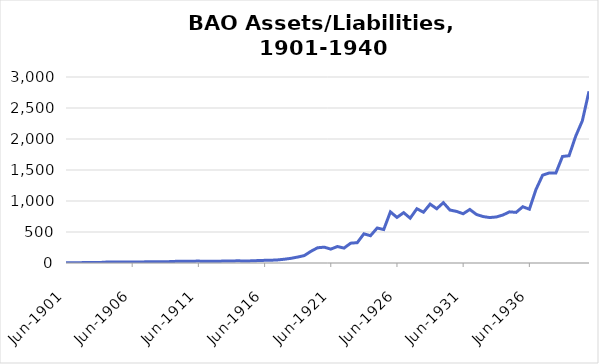
| Category | Series 0 |
|---|---|
| 1901-06-30 | 4347423.24 |
| 1901-12-31 | 5701801.87 |
| 1902-06-30 | 5460901.55 |
| 1902-12-31 | 6920376.16 |
| 1903-06-30 | 8138809.36 |
| 1903-12-31 | 7381254.11 |
| 1904-06-30 | 14180345.92 |
| 1904-12-31 | 14327951.69 |
| 1905-06-30 | 17002626.83 |
| 1905-12-31 | 15297768.24 |
| 1906-06-30 | 17615794.88 |
| 1906-12-31 | 16979536.36 |
| 1907-06-30 | 18381144.19 |
| 1907-12-31 | 19302410.73 |
| 1908-06-30 | 20133977.7 |
| 1908-12-31 | 18933944.17 |
| 1909-06-30 | 24284097 |
| 1909-12-31 | 28400846.69 |
| 1910-06-30 | 28297910.31 |
| 1910-12-31 | 28751207.71 |
| 1911-06-30 | 31184663.47 |
| 1911-12-31 | 26369824.47 |
| 1912-06-30 | 29372761.04 |
| 1912-12-31 | 28837219.37 |
| 1913-06-30 | 31783749.7 |
| 1913-12-31 | 31740690.29 |
| 1914-06-30 | 35888230.38 |
| 1914-12-31 | 30907130.49 |
| 1915-06-30 | 34930676.4 |
| 1915-12-31 | 39093168.69 |
| 1916-06-30 | 42729408.95 |
| 1916-12-31 | 44655643.8 |
| 1917-06-30 | 50157286.07 |
| 1917-12-31 | 61230954.44 |
| 1918-06-30 | 75609517.02 |
| 1918-12-31 | 96079346.49 |
| 1919-06-30 | 119604437.69 |
| 1919-12-31 | 188627129.17 |
| 1920-06-30 | 245568948.68 |
| 1920-12-31 | 255318210.12 |
| 1921-06-30 | 223939004.66 |
| 1921-12-31 | 265998252.59 |
| 1922-06-30 | 240257778.75 |
| 1922-12-31 | 319711208.13 |
| 1923-06-30 | 328044432.19 |
| 1923-12-31 | 470540181.49 |
| 1924-06-30 | 440120599.58 |
| 1924-12-31 | 564502137.2 |
| 1925-06-30 | 539677477.88 |
| 1925-12-31 | 824573455.46 |
| 1926-06-30 | 735535726.42 |
| 1926-12-31 | 812045960.24 |
| 1927-06-30 | 722893858.94 |
| 1927-12-31 | 875375086.93 |
| 1928-06-30 | 819121632.82 |
| 1928-12-31 | 949933801.2 |
| 1929-06-30 | 875043764.85 |
| 1929-12-31 | 973051656.99 |
| 1930-06-30 | 853991721.05 |
| 1930-12-31 | 832281346.66 |
| 1931-06-30 | 794312373.18 |
| 1931-12-31 | 863653989.57 |
| 1932-06-30 | 782967983.13 |
| 1932-12-31 | 749175374.85 |
| 1933-06-30 | 733034106.02 |
| 1933-12-31 | 742348484.83 |
| 1934-06-30 | 774007577.17 |
| 1934-12-31 | 825191927.41 |
| 1935-06-30 | 816480596.68 |
| 1935-12-31 | 907351917.9 |
| 1936-06-30 | 867633967 |
| 1936-12-31 | 1187487466.34 |
| 1937-06-30 | 1415857642.38 |
| 1937-12-31 | 1453085549.88 |
| 1938-06-30 | 1450431426.33 |
| 1938-12-31 | 1718294952.52 |
| 1939-06-30 | 1730426176.4 |
| 1939-12-31 | 2046888972.84 |
| 1940-06-30 | 2293152591.03 |
| 1940-12-31 | 2769011642.25 |